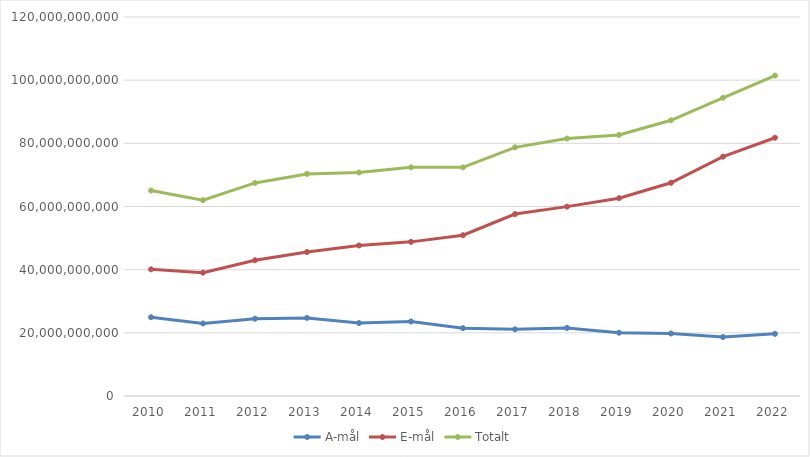
| Category | A-mål | E-mål | Totalt |
|---|---|---|---|
| 2010.0 | 24945752674 | 40103634064 | 65049386738 |
| 2011.0 | 22969806320 | 39053876936 | 62023683256 |
| 2012.0 | 24472022718 | 42986573713 | 67458596431 |
| 2013.0 | 24723698977 | 45590047798 | 70313746775 |
| 2014.0 | 23090343570 | 47662609473 | 70752953043 |
| 2015.0 | 23596671918 | 48802048954 | 72398720872 |
| 2016.0 | 21481652882 | 50908704749 | 72390357631 |
| 2017.0 | 21115606503 | 57616792687 | 78732399190 |
| 2018.0 | 21551242435 | 59962467055 | 81513709490 |
| 2019.0 | 20027727930 | 62636899184 | 82664627114 |
| 2020.0 | 19796344372 | 67504169122 | 87300513494 |
| 2021.0 | 18652409623 | 75777795035 | 94430204658 |
| 2022.0 | 19682930845 | 81767503819 | 101450434664 |